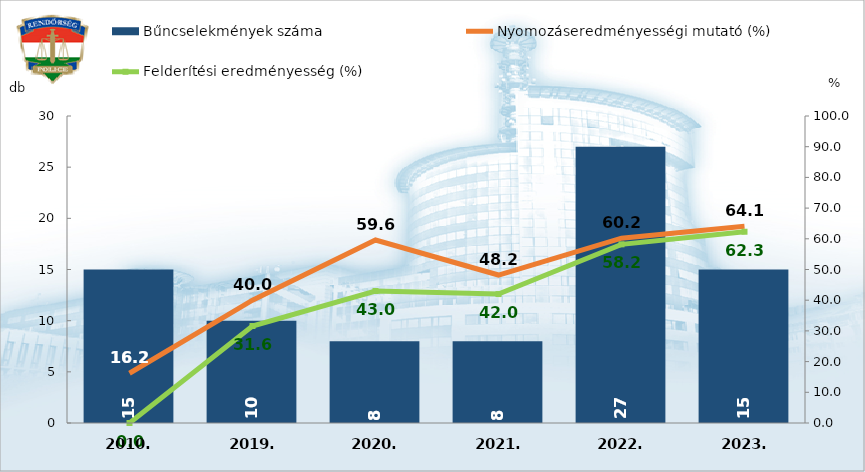
| Category | Bűncselekmények száma |
|---|---|
| 2010. | 15 |
| 2019. | 10 |
| 2020. | 8 |
| 2021. | 8 |
| 2022. | 27 |
| 2023. | 15 |